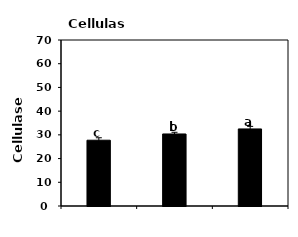
| Category | Cellulase activity(mg/d/g) |
|---|---|
| CK | 27.74 |
| FR | 30.376 |
| FRM | 32.5 |